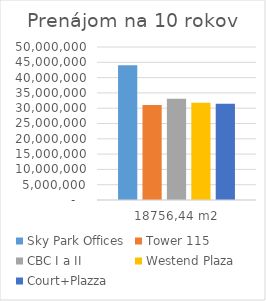
| Category | Sky Park Offices | Tower 115 | CBC I a II | Westend Plaza | Court+Plazza |
|---|---|---|---|---|---|
| 18756,44 m2 | 44034069.6 | 31030049.184 | 33086360.16 | 31795311.936 | 31483311.936 |